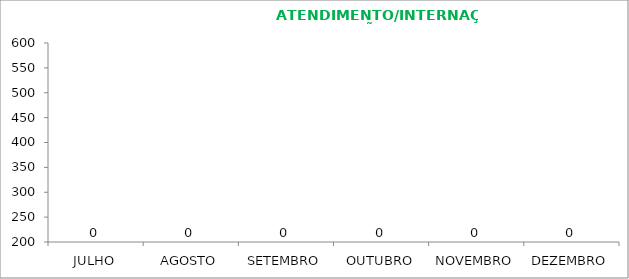
| Category | TOTAL |
|---|---|
| JULHO | 0 |
| AGOSTO | 0 |
| SETEMBRO | 0 |
| OUTUBRO | 0 |
| NOVEMBRO | 0 |
| DEZEMBRO | 0 |